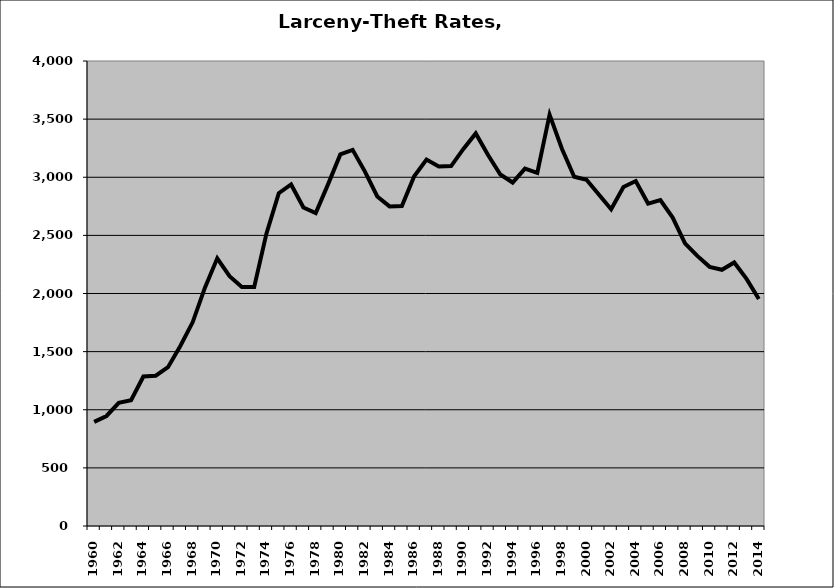
| Category | Larceny-Theft |
|---|---|
| 1960.0 | 895.754 |
| 1961.0 | 946.354 |
| 1962.0 | 1059.667 |
| 1963.0 | 1081.708 |
| 1964.0 | 1285.978 |
| 1965.0 | 1293.017 |
| 1966.0 | 1366.311 |
| 1967.0 | 1548.615 |
| 1968.0 | 1752.193 |
| 1969.0 | 2049.935 |
| 1970.0 | 2302.462 |
| 1971.0 | 2148.406 |
| 1972.0 | 2056.377 |
| 1973.0 | 2055.287 |
| 1974.0 | 2516.916 |
| 1975.0 | 2862.814 |
| 1976.0 | 2938.095 |
| 1977.0 | 2739.295 |
| 1978.0 | 2691.397 |
| 1979.0 | 2938.877 |
| 1980.0 | 3196.388 |
| 1981.0 | 3235.573 |
| 1982.0 | 3048.837 |
| 1983.0 | 2834.433 |
| 1984.0 | 2749.303 |
| 1985.0 | 2752.367 |
| 1986.0 | 3008.086 |
| 1987.0 | 3151.979 |
| 1988.0 | 3093.164 |
| 1989.0 | 3095.981 |
| 1990.0 | 3243.536 |
| 1991.0 | 3377.074 |
| 1992.0 | 3191.677 |
| 1993.0 | 3024.022 |
| 1994.0 | 2954.542 |
| 1995.0 | 3074.269 |
| 1996.0 | 3038.297 |
| 1997.0 | 3538.459 |
| 1998.0 | 3245.683 |
| 1999.0 | 3003.784 |
| 2000.0 | 2978.592 |
| 2001.0 | 2851.015 |
| 2002.0 | 2724.31 |
| 2003.0 | 2916.596 |
| 2004.0 | 2967.227 |
| 2005.0 | 2773.553 |
| 2006.0 | 2804.446 |
| 2007.0 | 2652.633 |
| 2008.0 | 2431.851 |
| 2009.0 | 2323.692 |
| 2010.0 | 2229.21 |
| 2011.0 | 2203.85 |
| 2012.0 | 2267.036 |
| 2013.0 | 2125.733 |
| 2014.0 | 1952.362 |